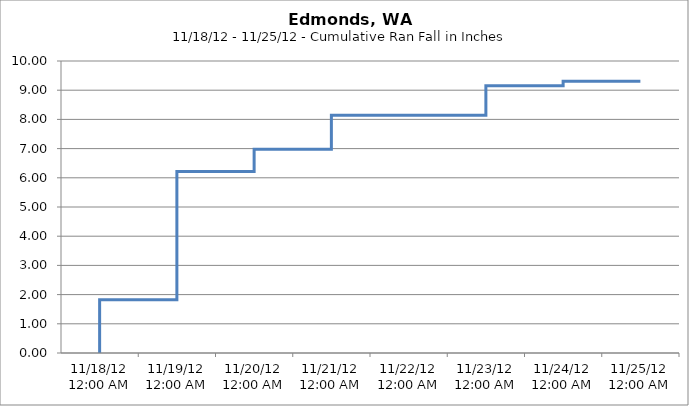
| Category | Cum Rain |
|---|---|
| 11/18/12 | 0 |
| 11/18/12 | 0 |
| 11/18/12 | 0.08 |
| 11/18/12 | 0.08 |
| 11/18/12 | 0.08 |
| 11/18/12 | 0.17 |
| 11/18/12 | 0.17 |
| 11/18/12 | 0.17 |
| 11/18/12 | 0.25 |
| 11/18/12 | 0.42 |
| 11/18/12 | 0.5 |
| 11/18/12 | 0.58 |
| 11/18/12 | 0.58 |
| 11/18/12 | 0.58 |
| 11/18/12 | 0.67 |
| 11/18/12 | 0.67 |
| 11/18/12 | 0.75 |
| 11/18/12 | 0.92 |
| 11/18/12 | 1.08 |
| 11/18/12 | 1.41 |
| 11/18/12 | 1.58 |
| 11/18/12 | 1.74 |
| 11/18/12 | 1.82 |
| 11/18/12 | 1.82 |
| 11/19/12 | 1.82 |
| 11/19/12 | 1.82 |
| 11/19/12 | 1.82 |
| 11/19/12 | 1.82 |
| 11/19/12 | 1.82 |
| 11/19/12 | 1.82 |
| 11/19/12 | 2.08 |
| 11/19/12 | 2.49 |
| 11/19/12 | 2.99 |
| 11/19/12 | 3.32 |
| 11/19/12 | 3.74 |
| 11/19/12 | 4.15 |
| 11/19/12 | 4.89 |
| 11/19/12 | 5.48 |
| 11/19/12 | 5.81 |
| 11/19/12 | 5.81 |
| 11/19/12 | 5.81 |
| 11/19/12 | 6.06 |
| 11/19/12 | 6.22 |
| 11/19/12 | 6.22 |
| 11/19/12 | 6.22 |
| 11/19/12 | 6.22 |
| 11/19/12 | 6.22 |
| 11/19/12 | 6.22 |
| 11/20/12 | 6.22 |
| 11/20/12 | 6.22 |
| 11/20/12 | 6.22 |
| 11/20/12 | 6.22 |
| 11/20/12 | 6.22 |
| 11/20/12 | 6.22 |
| 11/20/12 | 6.31 |
| 11/20/12 | 6.31 |
| 11/20/12 | 6.31 |
| 11/20/12 | 6.31 |
| 11/20/12 | 6.31 |
| 11/20/12 | 6.31 |
| 11/20/12 | 6.56 |
| 11/20/12 | 6.56 |
| 11/20/12 | 6.65 |
| 11/20/12 | 6.65 |
| 11/20/12 | 6.65 |
| 11/20/12 | 6.65 |
| 11/20/12 | 6.65 |
| 11/20/12 | 6.73 |
| 11/20/12 | 6.89 |
| 11/20/12 | 6.98 |
| 11/20/12 | 6.98 |
| 11/20/12 | 6.98 |
| 11/21/12 | 6.98 |
| 11/21/12 | 6.98 |
| 11/21/12 | 6.98 |
| 11/21/12 | 7.31 |
| 11/21/12 | 7.31 |
| 11/21/12 | 7.48 |
| 11/21/12 | 8.06 |
| 11/21/12 | 8.14 |
| 11/21/12 | 8.14 |
| 11/21/12 | 8.14 |
| 11/21/12 | 8.14 |
| 11/21/12 | 8.14 |
| 11/21/12 | 8.14 |
| 11/21/12 | 8.14 |
| 11/21/12 | 8.14 |
| 11/21/12 | 8.14 |
| 11/21/12 | 8.14 |
| 11/21/12 | 8.14 |
| 11/21/12 | 8.14 |
| 11/21/12 | 8.14 |
| 11/21/12 | 8.14 |
| 11/21/12 | 8.14 |
| 11/21/12 | 8.14 |
| 11/21/12 | 8.14 |
| 11/22/12 | 8.14 |
| 11/22/12 | 8.14 |
| 11/22/12 | 8.14 |
| 11/22/12 | 8.14 |
| 11/22/12 | 8.14 |
| 11/22/12 | 8.14 |
| 11/22/12 | 8.14 |
| 11/22/12 | 8.14 |
| 11/22/12 | 8.14 |
| 11/22/12 | 8.14 |
| 11/22/12 | 8.14 |
| 11/22/12 | 8.14 |
| 11/22/12 | 8.14 |
| 11/22/12 | 8.14 |
| 11/22/12 | 8.14 |
| 11/22/12 | 8.14 |
| 11/22/12 | 8.14 |
| 11/22/12 | 8.14 |
| 11/22/12 | 8.14 |
| 11/22/12 | 8.14 |
| 11/22/12 | 8.14 |
| 11/22/12 | 8.14 |
| 11/22/12 | 8.14 |
| 11/22/12 | 8.14 |
| 11/23/12 | 8.14 |
| 11/23/12 | 8.14 |
| 11/23/12 | 8.14 |
| 11/23/12 | 8.14 |
| 11/23/12 | 8.14 |
| 11/23/12 | 8.14 |
| 11/23/12 | 8.14 |
| 11/23/12 | 8.14 |
| 11/23/12 | 8.23 |
| 11/23/12 | 8.39 |
| 11/23/12 | 8.39 |
| 11/23/12 | 8.39 |
| 11/23/12 | 8.39 |
| 11/23/12 | 8.48 |
| 11/23/12 | 8.56 |
| 11/23/12 | 8.73 |
| 11/23/12 | 8.73 |
| 11/23/12 | 8.81 |
| 11/23/12 | 8.98 |
| 11/23/12 | 9.06 |
| 11/23/12 | 9.06 |
| 11/23/12 | 9.06 |
| 11/23/12 | 9.06 |
| 11/23/12 | 9.15 |
| 11/24/12 | 9.15 |
| 11/24/12 | 9.23 |
| 11/24/12 | 9.23 |
| 11/24/12 | 9.23 |
| 11/24/12 | 9.23 |
| 11/24/12 | 9.23 |
| 11/24/12 | 9.23 |
| 11/24/12 | 9.31 |
| 11/24/12 | 9.31 |
| 11/24/12 | 9.31 |
| 11/24/12 | 9.31 |
| 11/24/12 | 9.31 |
| 11/24/12 | 9.31 |
| 11/24/12 | 9.31 |
| 11/24/12 | 9.31 |
| 11/24/12 | 9.31 |
| 11/24/12 | 9.31 |
| 11/24/12 | 9.31 |
| 11/24/12 | 9.31 |
| 11/24/12 | 9.31 |
| 11/24/12 | 9.31 |
| 11/24/12 | 9.31 |
| 11/24/12 | 9.31 |
| 11/24/12 | 9.31 |
| 11/25/12 | 9.31 |
| 11/25/12 | 9.31 |
| 11/25/12 | 9.31 |
| 11/25/12 | 9.31 |
| 11/25/12 | 9.31 |
| 11/25/12 | 9.31 |
| 11/25/12 | 9.31 |
| 11/25/12 | 9.31 |
| 11/25/12 | 9.31 |
| 11/25/12 | 9.31 |
| 11/25/12 | 9.31 |
| 11/25/12 | 9.31 |
| 11/25/12 | 9.31 |
| 11/25/12 | 9.31 |
| 11/25/12 | 9.31 |
| 11/25/12 | 9.31 |
| 11/25/12 | 9.31 |
| 11/25/12 | 9.31 |
| 11/25/12 | 9.31 |
| 11/25/12 | 9.31 |
| 11/25/12 | 9.31 |
| 11/25/12 | 9.31 |
| 11/25/12 | 9.31 |
| 11/25/12 | 9.31 |
| 11/25/12 | 9.31 |